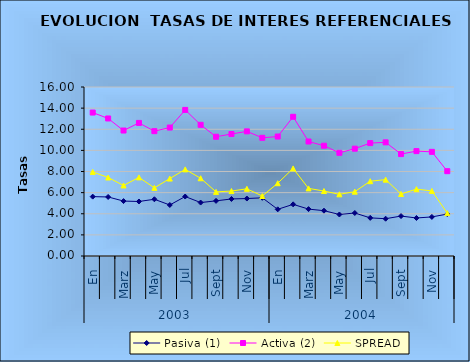
| Category | Pasiva (1) | Activa (2) | SPREAD |
|---|---|---|---|
| 0 | 5.62 | 13.58 | 7.96 |
| 1 | 5.59 | 13.02 | 7.43 |
| 2 | 5.2 | 11.88 | 6.68 |
| 3 | 5.16 | 12.6 | 7.44 |
| 4 | 5.37 | 11.82 | 6.45 |
| 5 | 4.83 | 12.16 | 7.33 |
| 6 | 5.63 | 13.83 | 8.2 |
| 7 | 5.06 | 12.42 | 7.36 |
| 8 | 5.22 | 11.29 | 6.07 |
| 9 | 5.4 | 11.55 | 6.15 |
| 10 | 5.44 | 11.8 | 6.36 |
| 11 | 5.51 | 11.19 | 5.68 |
| 12 | 4.42 | 11.31 | 6.89 |
| 13 | 4.89 | 13.18 | 8.29 |
| 14 | 4.44 | 10.84 | 6.4 |
| 15 | 4.29 | 10.44 | 6.15 |
| 16 | 3.93 | 9.77 | 5.84 |
| 17 | 4.07 | 10.16 | 6.09 |
| 18 | 3.61 | 10.69 | 7.08 |
| 19 | 3.53 | 10.76 | 7.23 |
| 20 | 3.78 | 9.65 | 5.87 |
| 21 | 3.6 | 9.93 | 6.33 |
| 22 | 3.7 | 9.86 | 6.16 |
| 23 | 3.97 | 8.03 | 4.06 |